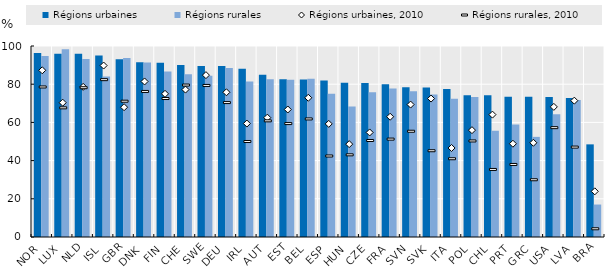
| Category | Régions urbaines | Régions rurales |
|---|---|---|
| NOR | 96.29 | 94.706 |
| LUX | 95.974 | 98.274 |
| NLD | 95.934 | 93.13 |
| ISL | 95.02 | 84.096 |
| GBR | 93.037 | 93.662 |
| DNK | 91.511 | 91.312 |
| FIN | 91.166 | 86.661 |
| CHE | 89.99 | 85.19 |
| SWE | 89.57 | 84.42 |
| DEU | 89.534 | 88.423 |
| IRL | 88.058 | 81.386 |
| AUT | 84.888 | 82.654 |
| EST | 82.529 | 82.293 |
| BEL | 82.504 | 82.886 |
| ESP | 81.891 | 75.024 |
| HUN | 80.754 | 68.384 |
| CZE | 80.601 | 75.845 |
| FRA | 79.962 | 77.774 |
| SVN | 78.36 | 76.329 |
| SVK | 78.262 | 74.6 |
| ITA | 77.526 | 72.338 |
| POL | 74.262 | 73.335 |
| CHL | 74.193 | 55.626 |
| PRT | 73.46 | 58.842 |
| GRC | 73.37 | 52.424 |
| USA | 73.29 | 64.29 |
| LVA | 72.715 | 71.734 |
| BRA | 48.5 | 17 |